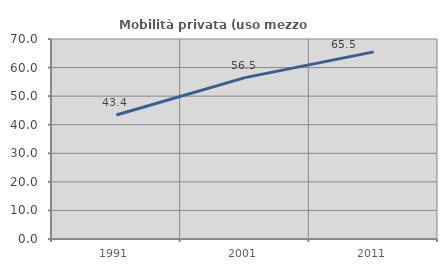
| Category | Mobilità privata (uso mezzo privato) |
|---|---|
| 1991.0 | 43.413 |
| 2001.0 | 56.481 |
| 2011.0 | 65.495 |